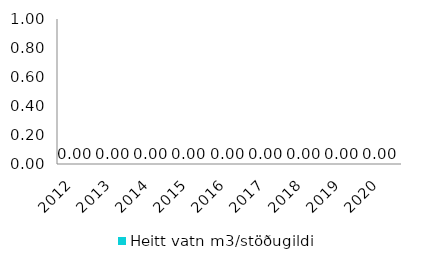
| Category | Heitt vatn m3/stöðugildi |
|---|---|
| 2012.0 | 0 |
| 2013.0 | 0 |
| 2014.0 | 0 |
| 2015.0 | 0 |
| 2016.0 | 0 |
| 2017.0 | 0 |
| 2018.0 | 0 |
| 2019.0 | 0 |
| 2020.0 | 0 |